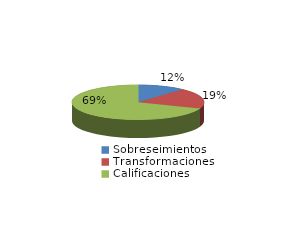
| Category | Series 0 |
|---|---|
| Sobreseimientos | 263 |
| Transformaciones | 435 |
| Calificaciones | 1565 |